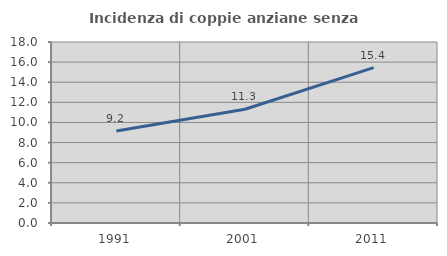
| Category | Incidenza di coppie anziane senza figli  |
|---|---|
| 1991.0 | 9.151 |
| 2001.0 | 11.314 |
| 2011.0 | 15.45 |